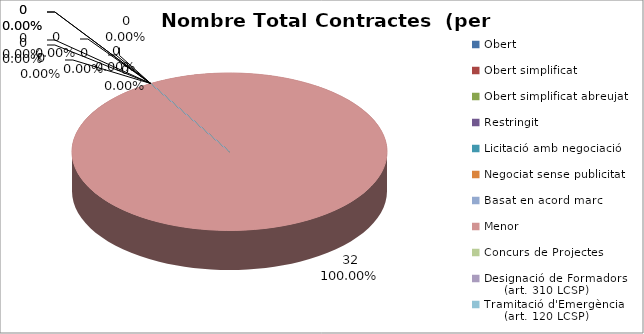
| Category | Nombre Total Contractes |
|---|---|
| Obert | 0 |
| Obert simplificat | 0 |
| Obert simplificat abreujat | 0 |
| Restringit | 0 |
| Licitació amb negociació | 0 |
| Negociat sense publicitat | 0 |
| Basat en acord marc | 0 |
| Menor | 32 |
| Concurs de Projectes | 0 |
| Designació de Formadors
     (art. 310 LCSP) | 0 |
| Tramitació d'Emergència
     (art. 120 LCSP) | 0 |